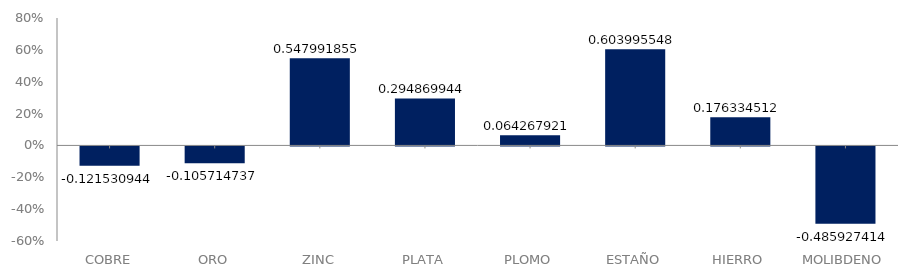
| Category | Series 0 |
|---|---|
| COBRE | -0.122 |
| ORO | -0.106 |
| ZINC | 0.548 |
| PLATA | 0.295 |
| PLOMO | 0.064 |
| ESTAÑO | 0.604 |
| HIERRO | 0.176 |
| MOLIBDENO | -0.486 |